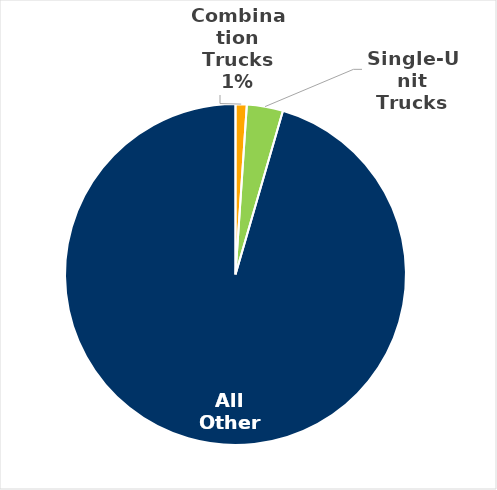
| Category | Vehicle Population (Millions) |
|---|---|
| Combination Trucks | 2.892 |
| Single-Unit Trucks | 9.337 |
| All Other | 260.252 |